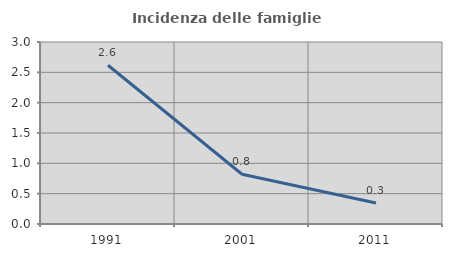
| Category | Incidenza delle famiglie numerose |
|---|---|
| 1991.0 | 2.617 |
| 2001.0 | 0.82 |
| 2011.0 | 0.346 |